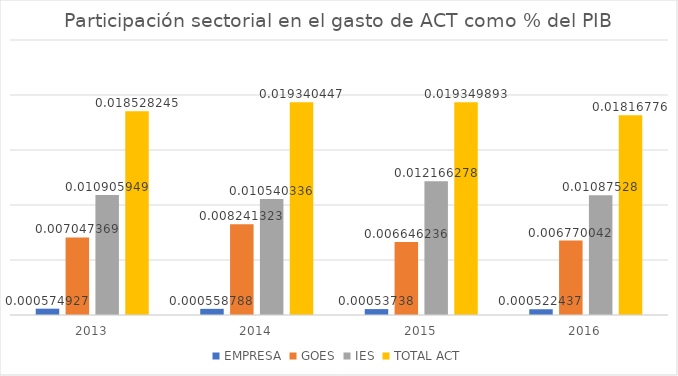
| Category | EMPRESA | GOES | IES | TOTAL ACT |
|---|---|---|---|---|
| 2013 | 0.001 | 0.007 | 0.011 | 0.019 |
| 2014 | 0.001 | 0.008 | 0.011 | 0.019 |
| 2015 | 0.001 | 0.007 | 0.012 | 0.019 |
| 2016 | 0.001 | 0.007 | 0.011 | 0.018 |